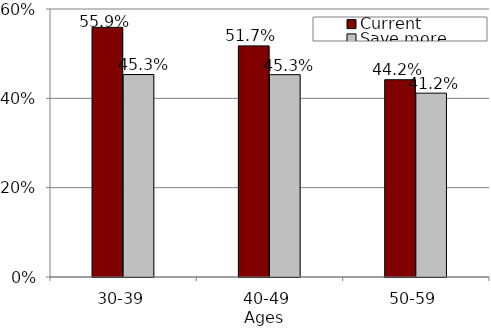
| Category | Current | Save more |
|---|---|---|
| 30-39 | 0.559 | 0.453 |
| 40-49 | 0.517 | 0.453 |
| 50-59 | 0.442 | 0.412 |